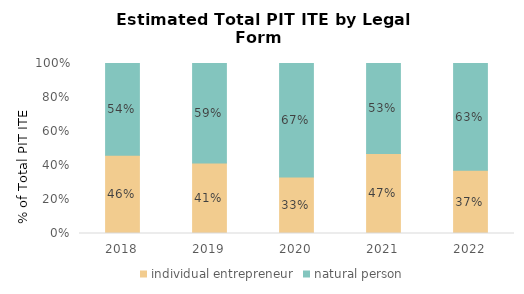
| Category | individual entrepreneur | natural person |
|---|---|---|
| 2018.0 | 0.46 | 0.54 |
| 2019.0 | 0.415 | 0.585 |
| 2020.0 | 0.332 | 0.668 |
| 2021.0 | 0.471 | 0.529 |
| 2022.0 | 0.372 | 0.628 |